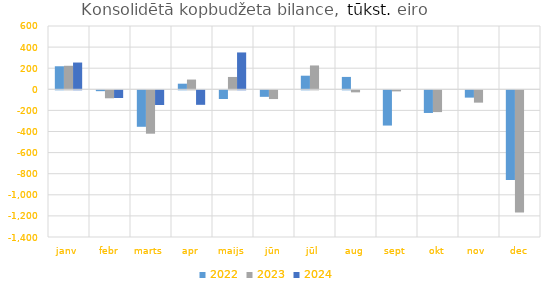
| Category | 2022 | 2023 | 2024 |
|---|---|---|---|
| janv | 218389.091 | 223039.368 | 253732.151 |
| febr | -8203.95 | -75727.525 | -72861.155 |
| marts | -345869.737 | -411380.469 | -139295.222 |
| apr | 53138.837 | 92355.55 | -137655.898 |
| maijs | -82553.768 | 116986.885 | 349316.144 |
| jūn | -61976.694 | -83017.071 | 0 |
| jūl | 128860.015 | 225991.399 | 0 |
| aug | 117341.161 | -19435.504 | 0 |
| sept | -334219.509 | -10334.49 | 0 |
| okt | -214870.466 | -206638.491 | 0 |
| nov | -69420.277 | -117014.401 | 0 |
| dec | -851302.945 | -1157739.041 | 0 |